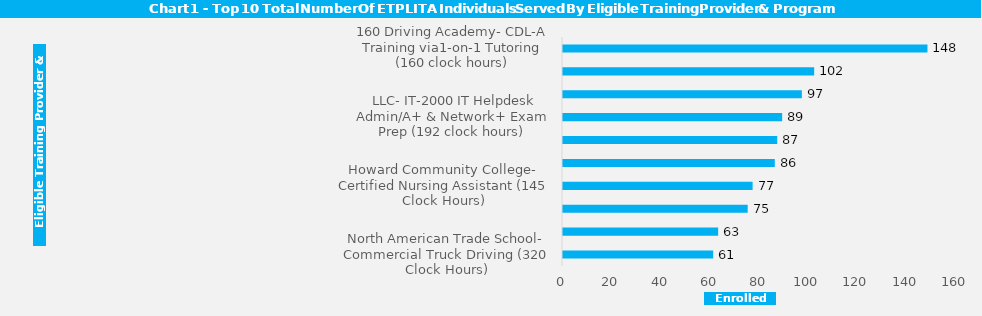
| Category | Total |
|---|---|
| North American Trade School- Commercial Truck Driving (320 Clock Hours) | 61 |
| Wor-Wic Community College- Certified Nursing Assistant (128 Clock Hours) | 63 |
| Chesapeake College- Certified Nursing Assistant (145 Clock Hours) | 75 |
| Howard Community College- Certified Nursing Assistant (145 Clock Hours) | 77 |
| Baltimore City Community College- Multi-Skilled Medical Technician (380 Clock Hours) | 86 |
| Medcerts, LLC- IT-2000 IT Helpdesk Admin/A+ & Network+ Exam Prep (192 clock hours) | 87 |
| It Works Learning Center Inc.- Certified Nursing Asst. & Geriatric Nursing Asst. (140 Clock Hours) | 89 |
| Wor-Wic Community College- Commercial Truck Driver Training: Class A (320 Clock Hours) | 97 |
| 160 Driving Academy- CDL-A Training via1-on-1 Tutoring (160 clock hours) | 102 |
| Chesapeake College- Commercial Driver Licensing Prep Class A (280 Clock Hours) | 148 |